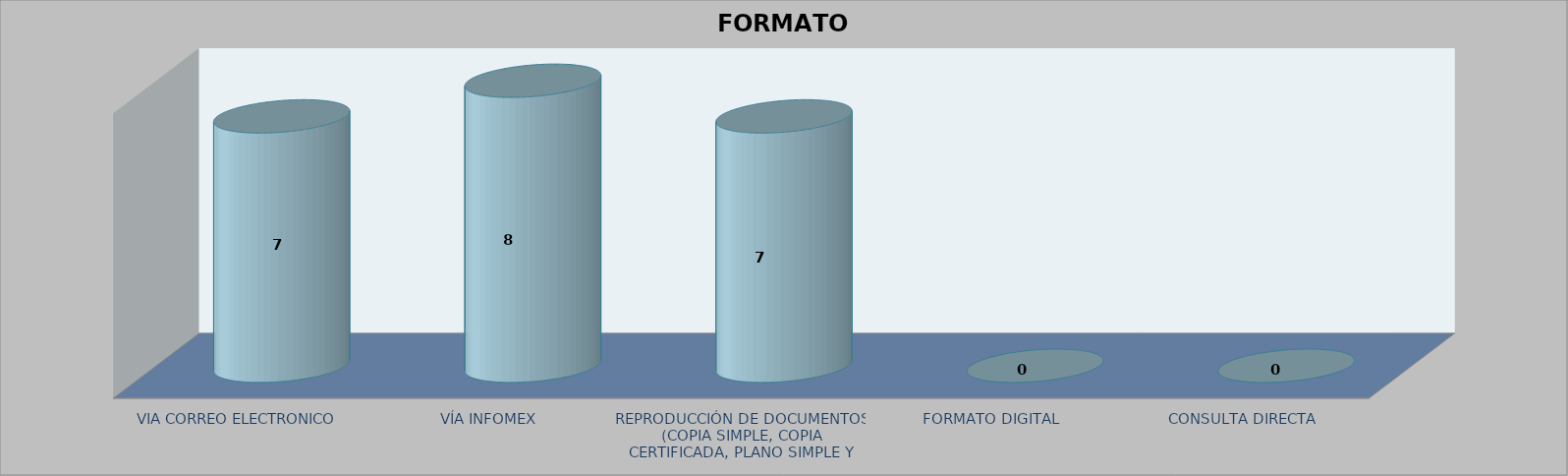
| Category |        FORMATO SOLICITADO | Series 1 | Series 2 |
|---|---|---|---|
| VIA CORREO ELECTRONICO |  |  | 7 |
| VÍA INFOMEX |  |  | 8 |
| REPRODUCCIÓN DE DOCUMENTOS (COPIA SIMPLE, COPIA CERTIFICADA, PLANO SIMPLE Y PLANO CERTIFICADO) |  |  | 7 |
| FORMATO DIGITAL |  |  | 0 |
| CONSULTA DIRECTA |  |  | 0 |